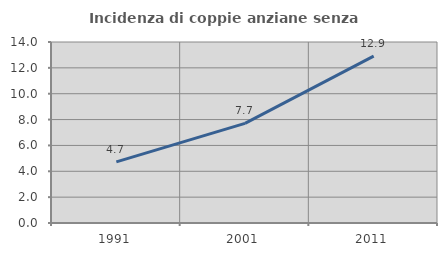
| Category | Incidenza di coppie anziane senza figli  |
|---|---|
| 1991.0 | 4.733 |
| 2001.0 | 7.702 |
| 2011.0 | 12.913 |